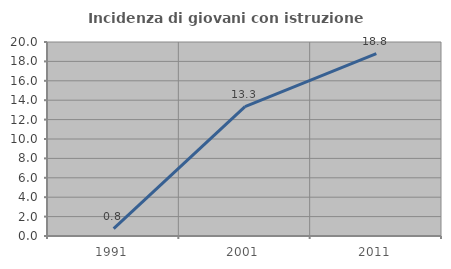
| Category | Incidenza di giovani con istruzione universitaria |
|---|---|
| 1991.0 | 0.758 |
| 2001.0 | 13.333 |
| 2011.0 | 18.803 |